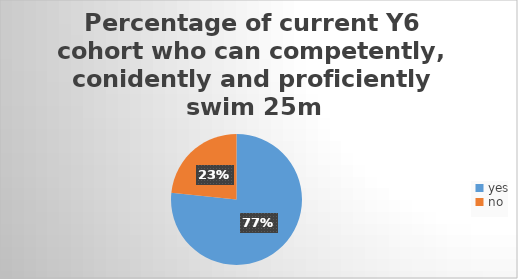
| Category | Series 1 | Series 2 | Series 0 |
|---|---|---|---|
| yes | 23 | 23 | 23 |
| no | 7 | 7 | 7 |